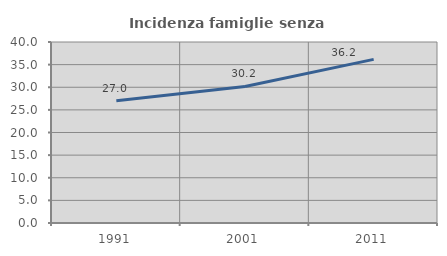
| Category | Incidenza famiglie senza nuclei |
|---|---|
| 1991.0 | 27.042 |
| 2001.0 | 30.179 |
| 2011.0 | 36.159 |